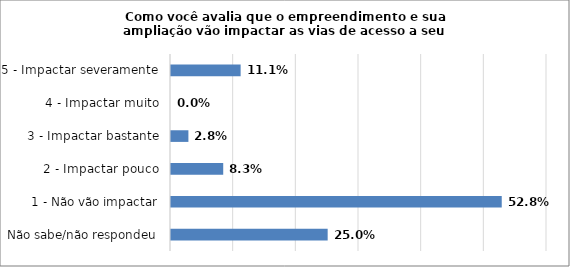
| Category | Series 0 |
|---|---|
| Não sabe/não respondeu | 0.25 |
| 1 - Não vão impactar | 0.528 |
| 2 - Impactar pouco | 0.083 |
| 3 - Impactar bastante | 0.028 |
| 4 - Impactar muito | 0 |
| 5 - Impactar severamente | 0.111 |